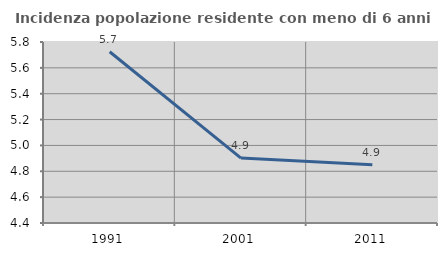
| Category | Incidenza popolazione residente con meno di 6 anni |
|---|---|
| 1991.0 | 5.725 |
| 2001.0 | 4.902 |
| 2011.0 | 4.851 |